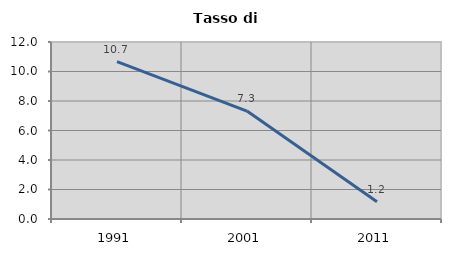
| Category | Tasso di disoccupazione   |
|---|---|
| 1991.0 | 10.674 |
| 2001.0 | 7.317 |
| 2011.0 | 1.176 |